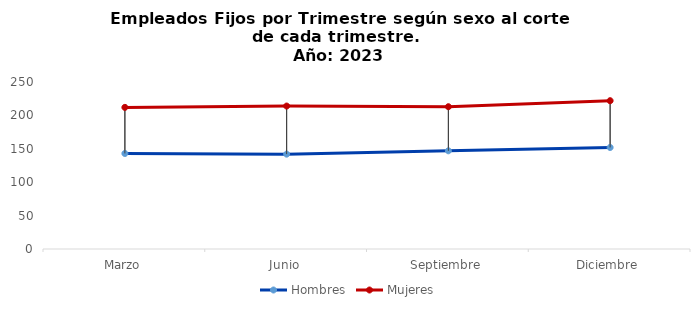
| Category | Hombres | Mujeres |
|---|---|---|
| Marzo | 143 | 212 |
| Junio | 142 | 214 |
| Septiembre | 147 | 213 |
| Diciembre | 152 | 222 |